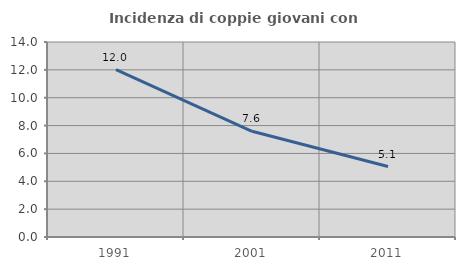
| Category | Incidenza di coppie giovani con figli |
|---|---|
| 1991.0 | 12.019 |
| 2001.0 | 7.591 |
| 2011.0 | 5.057 |